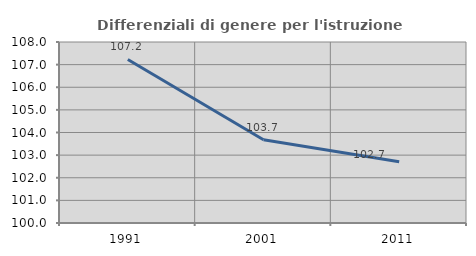
| Category | Differenziali di genere per l'istruzione superiore |
|---|---|
| 1991.0 | 107.228 |
| 2001.0 | 103.679 |
| 2011.0 | 102.703 |